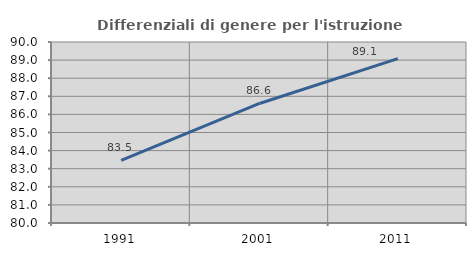
| Category | Differenziali di genere per l'istruzione superiore |
|---|---|
| 1991.0 | 83.462 |
| 2001.0 | 86.603 |
| 2011.0 | 89.081 |